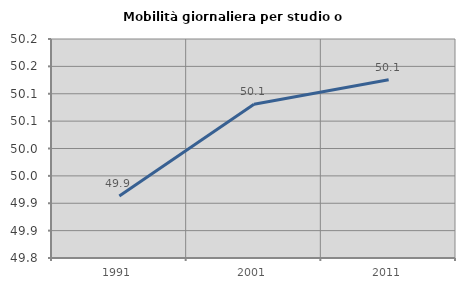
| Category | Mobilità giornaliera per studio o lavoro |
|---|---|
| 1991.0 | 49.913 |
| 2001.0 | 50.081 |
| 2011.0 | 50.126 |